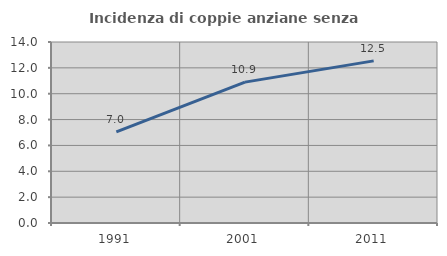
| Category | Incidenza di coppie anziane senza figli  |
|---|---|
| 1991.0 | 7.046 |
| 2001.0 | 10.898 |
| 2011.0 | 12.539 |